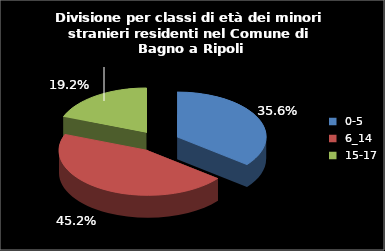
| Category | Series 0 | Series 1 |
|---|---|---|
| 0-5 | 119 |  |
| 6_14 | 151 |  |
| 15-17 | 64 |  |